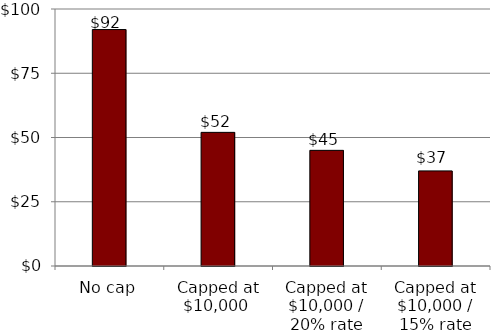
| Category | Series 0 |
|---|---|
| No cap | 92 |
| Capped at $10,000  | 52 |
| Capped at $10,000 / 20% rate | 45 |
| Capped at $10,000 / 15% rate | 37 |